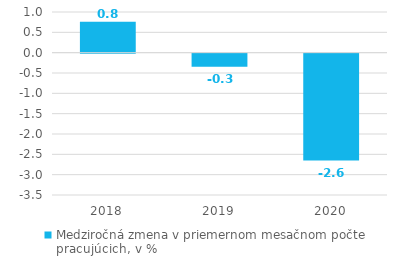
| Category | Medziročná zmena v priemernom mesačnom počte pracujúcich, v % |
|---|---|
| 2018.0 | 0.759 |
| 2019.0 | -0.322 |
| 2020.0 | -2.63 |